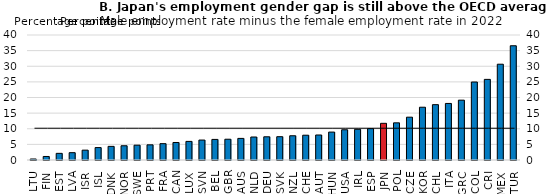
| Category | Employment gap between male and female employment rates, percentage points |
|---|---|
| LTU | 0.321 |
| FIN | 1.128 |
| EST | 2.127 |
| LVA | 2.341 |
| ISR | 3.151 |
| ISL | 3.97 |
| DNK | 4.363 |
| NOR | 4.557 |
| SWE | 4.745 |
| PRT | 4.855 |
| FRA | 5.229 |
| CAN | 5.605 |
| LUX | 5.954 |
| SVN | 6.385 |
| BEL | 6.586 |
| GBR | 6.647 |
| AUS | 6.915 |
| NLD | 7.357 |
| DEU | 7.427 |
| SVK | 7.456 |
| NZL | 7.757 |
| CHE | 7.934 |
| AUT | 8.001 |
| HUN | 8.931 |
| USA | 9.675 |
| IRL | 9.82 |
| ESP | 10.028 |
| JPN | 11.737 |
| POL | 11.891 |
| CZE | 13.7 |
| KOR | 16.888 |
| CHL | 17.706 |
| ITA | 18.097 |
| GRC | 19.149 |
| COL | 24.957 |
| CRI | 25.799 |
| MEX | 30.653 |
| TUR | 36.558 |